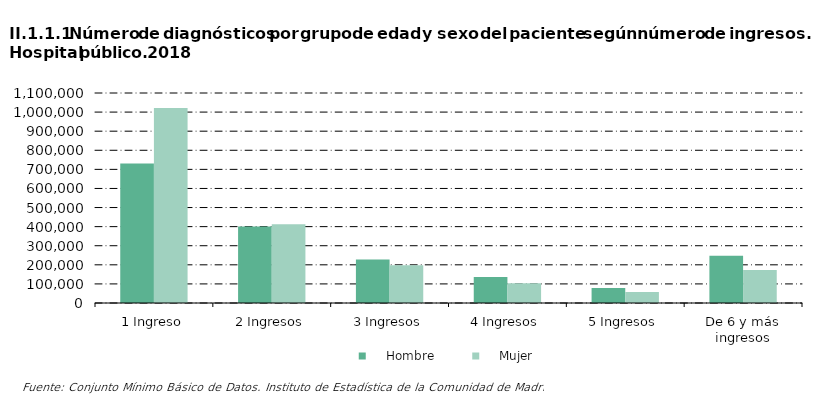
| Category |     Hombre |     Mujer |
|---|---|---|
| 1 Ingreso | 730512 | 1021527 |
| 2 Ingresos | 400270 | 412220 |
| 3 Ingresos | 228465 | 197766 |
| 4 Ingresos | 136483 | 103248 |
| 5 Ingresos | 78366 | 57093 |
| De 6 y más ingresos | 247766 | 172235 |